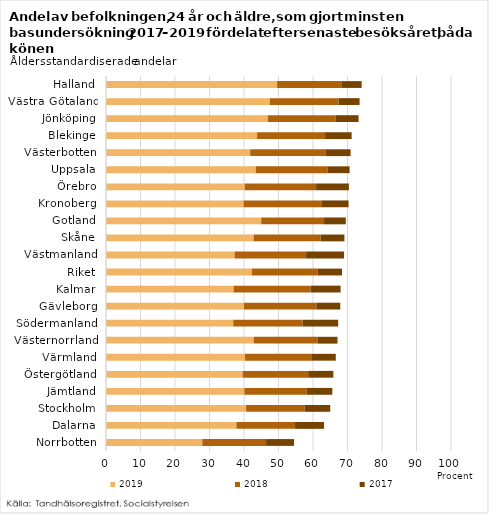
| Category | 2019 | 2018 | 2017 |
|---|---|---|---|
| Norrbotten | 27.9 | 18.5 | 8.1 |
| Dalarna | 37.8 | 17 | 8.4 |
| Stockholm | 40.6 | 17 | 7.4 |
| Jämtland | 40.1 | 18.1 | 7.4 |
| Östergötland | 39.6 | 19 | 7.3 |
| Värmland | 40.3 | 19.4 | 6.9 |
| Västernorrland | 42.8 | 18.5 | 5.8 |
| Södermanland | 36.9 | 20.1 | 10.3 |
| Gävleborg | 40 | 21 | 6.9 |
| Kalmar | 37 | 22.3 | 8.7 |
| Riket | 42.3 | 19 | 7.1 |
| Västmanland | 37.3 | 20.7 | 11 |
| Skåne | 42.8 | 19.4 | 6.9 |
| Gotland | 45 | 18.2 | 6.3 |
| Kronoberg | 39.9 | 22.5 | 7.9 |
| Örebro | 40.2 | 20.7 | 9.5 |
| Uppsala | 43.4 | 20.8 | 6.4 |
| Västerbotten | 41.8 | 21.8 | 7.3 |
| Blekinge | 43.8 | 19.7 | 7.7 |
| Jönköping | 46.9 | 19.7 | 6.6 |
| Västra Götaland | 47.5 | 19.9 | 6.1 |
| Halland | 49.6 | 18.6 | 5.9 |